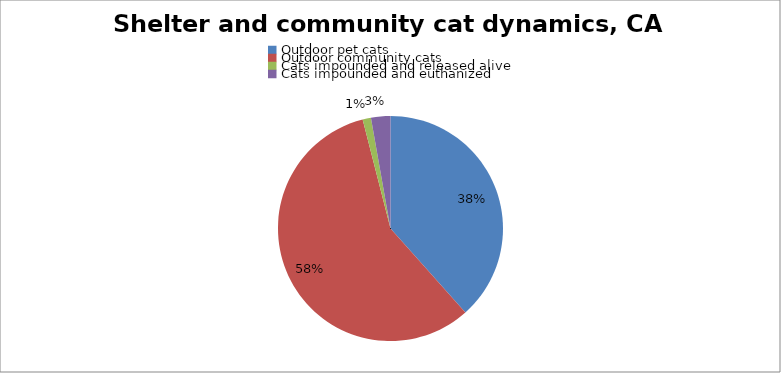
| Category | Series 0 |
|---|---|
| Outdoor pet cats | 3547995.81 |
| Outdoor community cats | 5321993.714 |
| Cats impounded and released alive | 110367.3 |
| Cats impounded and euthanized | 257523.7 |